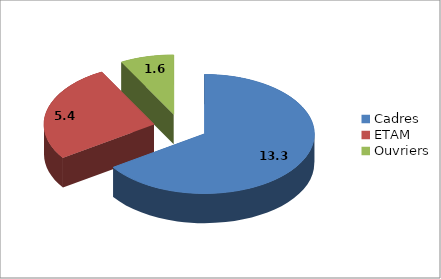
| Category | Series 0 |
|---|---|
| Cadres | 13.3 |
| ETAM | 5.4 |
| Ouvriers | 1.6 |